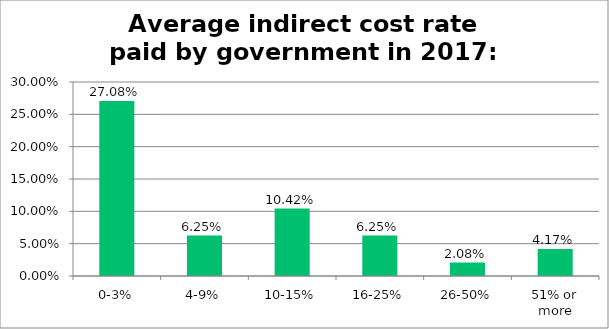
| Category | Responses |
|---|---|
| 0-3% | 0.271 |
| 4-9% | 0.062 |
| 10-15% | 0.104 |
| 16-25% | 0.062 |
| 26-50% | 0.021 |
| 51% or more | 0.042 |